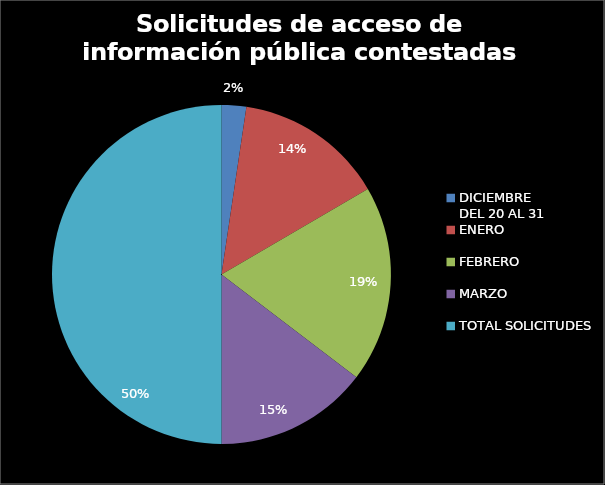
| Category | Solicitudes de acceso de información pública contestadas desde la UAC |
|---|---|
| DICIEMBRE 
DEL 20 AL 31 | 45 |
| ENERO | 272 |
| FEBRERO | 359 |
| MARZO | 280 |
| TOTAL SOLICITUDES | 956 |